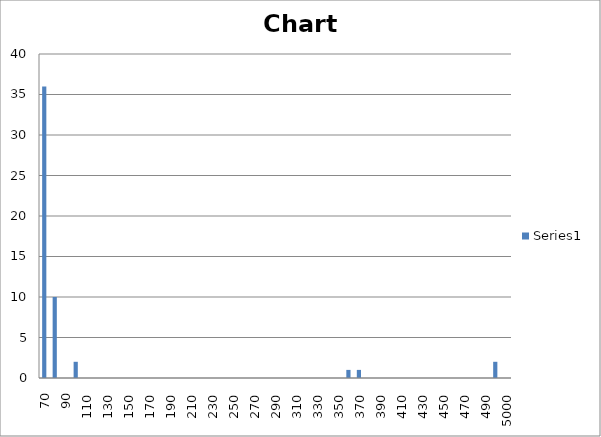
| Category | Series 0 |
|---|---|
| 70.0 | 36 |
| 80.0 | 10 |
| 90.0 | 0 |
| 100.0 | 2 |
| 110.0 | 0 |
| 120.0 | 0 |
| 130.0 | 0 |
| 140.0 | 0 |
| 150.0 | 0 |
| 160.0 | 0 |
| 170.0 | 0 |
| 180.0 | 0 |
| 190.0 | 0 |
| 200.0 | 0 |
| 210.0 | 0 |
| 220.0 | 0 |
| 230.0 | 0 |
| 240.0 | 0 |
| 250.0 | 0 |
| 260.0 | 0 |
| 270.0 | 0 |
| 280.0 | 0 |
| 290.0 | 0 |
| 300.0 | 0 |
| 310.0 | 0 |
| 320.0 | 0 |
| 330.0 | 0 |
| 340.0 | 0 |
| 350.0 | 0 |
| 360.0 | 1 |
| 370.0 | 1 |
| 380.0 | 0 |
| 390.0 | 0 |
| 400.0 | 0 |
| 410.0 | 0 |
| 420.0 | 0 |
| 430.0 | 0 |
| 440.0 | 0 |
| 450.0 | 0 |
| 460.0 | 0 |
| 470.0 | 0 |
| 480.0 | 0 |
| 490.0 | 0 |
| 500.0 | 2 |
| 5000.0 | 0 |